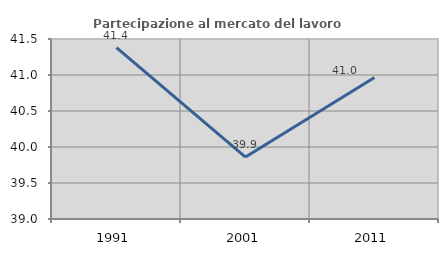
| Category | Partecipazione al mercato del lavoro  femminile |
|---|---|
| 1991.0 | 41.379 |
| 2001.0 | 39.861 |
| 2011.0 | 40.965 |